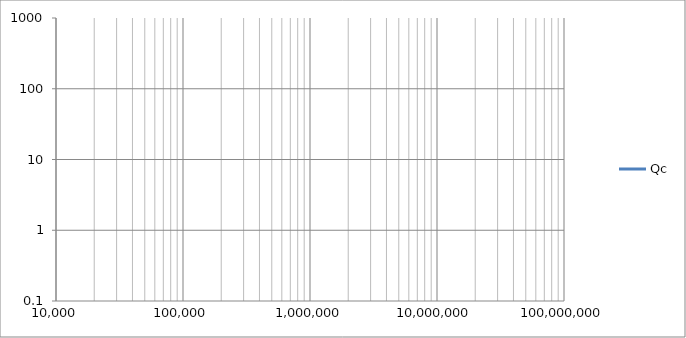
| Category | Qc |
|---|---|
| 300.0 | 13.985 |
| 308.982 | 12.086 |
| 318.234 | 12.381 |
| 327.762 | 12.87 |
| 337.575 | 13.091 |
| 347.683 | 13.652 |
| 358.093 | 13.87 |
| 368.814 | 14.169 |
| 379.857 | 14.576 |
| 391.23 | 15.074 |
| 402.944 | 15.55 |
| 415.009 | 16.359 |
| 427.434 | 16.381 |
| 440.232 | 17.245 |
| 453.413 | 17.623 |
| 466.989 | 18.268 |
| 480.971 | 18.899 |
| 495.372 | 19.556 |
| 510.204 | 19.558 |
| 525.48 | 20.106 |
| 541.213 | 20.949 |
| 557.417 | 21.407 |
| 574.107 | 21.695 |
| 591.296 | 22.242 |
| 609.0 | 22.685 |
| 627.234 | 23.336 |
| 646.015 | 24.001 |
| 665.357 | 24.457 |
| 685.278 | 25.302 |
| 705.796 | 25.876 |
| 726.928 | 26.497 |
| 748.693 | 26.907 |
| 771.11 | 27.737 |
| 794.198 | 28.277 |
| 817.977 | 28.243 |
| 842.468 | 29.579 |
| 867.692 | 30.068 |
| 893.672 | 30.589 |
| 920.429 | 30.889 |
| 947.988 | 31.031 |
| 976.372 | 32.179 |
| 1005.605 | 31.878 |
| 1035.714 | 32.568 |
| 1066.724 | 33.331 |
| 1098.663 | 33.691 |
| 1131.558 | 34.01 |
| 1165.438 | 34.395 |
| 1200.332 | 34.87 |
| 1236.272 | 35.597 |
| 1273.287 | 35.981 |
| 1311.41 | 36.493 |
| 1350.675 | 37.357 |
| 1391.116 | 37.522 |
| 1432.767 | 37.865 |
| 1475.666 | 38.747 |
| 1519.849 | 38.834 |
| 1565.354 | 39.549 |
| 1612.223 | 39.963 |
| 1660.494 | 40.322 |
| 1710.211 | 40.608 |
| 1761.417 | 40.702 |
| 1814.155 | 41.461 |
| 1868.473 | 41.749 |
| 1924.417 | 42.306 |
| 1982.036 | 42.968 |
| 2041.38 | 43.081 |
| 2102.501 | 43.45 |
| 2165.452 | 44.043 |
| 2230.287 | 44.468 |
| 2297.064 | 44.902 |
| 2365.841 | 45.117 |
| 2436.677 | 45.531 |
| 2509.633 | 45.663 |
| 2584.774 | 45.881 |
| 2662.165 | 46.528 |
| 2741.873 | 46.792 |
| 2823.967 | 47.087 |
| 2908.519 | 47.454 |
| 2995.603 | 48.038 |
| 3085.295 | 49.242 |
| 3177.672 | 49.362 |
| 3272.814 | 49.699 |
| 3370.806 | 50.016 |
| 3471.731 | 50.105 |
| 3575.678 | 50.604 |
| 3682.737 | 51.077 |
| 3793.002 | 51.571 |
| 3906.568 | 51.311 |
| 4023.535 | 51.797 |
| 4144.004 | 52.259 |
| 4268.079 | 52.175 |
| 4395.87 | 52.592 |
| 4527.487 | 52.774 |
| 4663.044 | 52.885 |
| 4802.66 | 52.998 |
| 4946.457 | 53.104 |
| 5094.558 | 53.041 |
| 5247.095 | 53.492 |
| 5404.198 | 53.626 |
| 5566.005 | 53.514 |
| 5732.657 | 53.522 |
| 5904.298 | 53.632 |
| 6081.079 | 52.102 |
| 6263.152 | 53.412 |
| 6450.677 | 53.574 |
| 6643.817 | 53.683 |
| 6842.74 | 53.533 |
| 7047.618 | 53.592 |
| 7258.631 | 53.478 |
| 7475.962 | 53.051 |
| 7699.799 | 53.455 |
| 7930.339 | 53.351 |
| 8167.781 | 53.398 |
| 8412.333 | 53.316 |
| 8664.207 | 53.419 |
| 8923.622 | 53.462 |
| 9190.804 | 53.362 |
| 9465.986 | 53.751 |
| 9749.407 | 53.921 |
| 10041.314 | 53.677 |
| 10341.961 | 53.887 |
| 10651.609 | 53.985 |
| 10970.529 | 54.211 |
| 11298.998 | 54.284 |
| 11637.301 | 54.455 |
| 11985.733 | 54.708 |
| 12344.598 | 54.835 |
| 12714.208 | 54.974 |
| 13094.884 | 55.195 |
| 13486.958 | 55.251 |
| 13890.771 | 55.649 |
| 14306.674 | 55.603 |
| 14735.03 | 55.95 |
| 15176.212 | 56.264 |
| 15630.603 | 56.602 |
| 16098.599 | 56.989 |
| 16580.607 | 57.441 |
| 17077.047 | 57.823 |
| 17588.351 | 58.342 |
| 18114.964 | 58.74 |
| 18657.344 | 59.1 |
| 19215.963 | 59.661 |
| 19791.308 | 60.009 |
| 20383.88 | 60.441 |
| 20994.194 | 60.982 |
| 21622.781 | 61.424 |
| 22270.189 | 61.956 |
| 22936.98 | 62.409 |
| 23623.736 | 62.966 |
| 24331.055 | 63.495 |
| 25059.551 | 63.873 |
| 25809.859 | 64.273 |
| 26582.632 | 64.736 |
| 27378.542 | 64.992 |
| 28198.283 | 65.316 |
| 29042.568 | 65.624 |
| 29912.132 | 65.817 |
| 30807.731 | 64.517 |
| 31730.145 | 64.597 |
| 32680.177 | 64.587 |
| 33658.654 | 64.614 |
| 34666.428 | 64.759 |
| 35704.376 | 65.169 |
| 36773.4 | 65.867 |
| 37874.433 | 66.518 |
| 39008.431 | 67.015 |
| 40176.383 | 67.355 |
| 41379.304 | 67.714 |
| 42618.241 | 67.998 |
| 43894.274 | 68.256 |
| 45208.513 | 68.596 |
| 46562.101 | 68.98 |
| 47956.216 | 69.366 |
| 49392.073 | 69.725 |
| 50870.922 | 67.792 |
| 52394.048 | 68.137 |
| 53962.778 | 68.54 |
| 55578.477 | 71.382 |
| 57242.553 | 71.827 |
| 58956.452 | 72.296 |
| 60721.667 | 70.307 |
| 62539.734 | 70.608 |
| 64412.237 | 71.067 |
| 66340.803 | 74.231 |
| 68327.113 | 74.078 |
| 70372.895 | 74.599 |
| 72479.93 | 75.06 |
| 74650.052 | 75.638 |
| 76885.149 | 76.422 |
| 79187.167 | 77.015 |
| 81558.11 | 77.728 |
| 84000.042 | 78.441 |
| 86515.087 | 78.698 |
| 89105.435 | 79.307 |
| 91773.341 | 80.039 |
| 94521.126 | 80.756 |
| 97351.184 | 81.474 |
| 100265.975 | 82.723 |
| 103268.039 | 83.442 |
| 106359.987 | 84.134 |
| 109544.512 | 84.883 |
| 112824.384 | 85.248 |
| 116202.459 | 85.982 |
| 119681.676 | 86.828 |
| 123265.065 | 87.6 |
| 126955.745 | 88.462 |
| 130756.927 | 89.216 |
| 134671.92 | 89.962 |
| 138704.132 | 90.83 |
| 142857.072 | 91.625 |
| 147134.356 | 92.432 |
| 151539.705 | 93.886 |
| 156076.956 | 94.748 |
| 160750.056 | 95.587 |
| 165563.073 | 95.969 |
| 170520.197 | 96.847 |
| 175625.742 | 97.796 |
| 180884.152 | 98.744 |
| 186300.005 | 99.62 |
| 191878.013 | 100.6 |
| 197623.033 | 101.571 |
| 203540.064 | 103.091 |
| 209634.257 | 104.091 |
| 215910.916 | 105.136 |
| 222375.505 | 105.804 |
| 229033.65 | 106.863 |
| 235891.146 | 107.958 |
| 242953.963 | 109.17 |
| 250228.248 | 110.312 |
| 257720.332 | 111.52 |
| 265436.736 | 112.741 |
| 273384.177 | 113.986 |
| 281569.573 | 115.219 |
| 290000.047 | 116.407 |
| 298682.939 | 118.02 |
| 307625.805 | 119.042 |
| 316836.429 | 119.964 |
| 326322.828 | 120.941 |
| 336093.26 | 121.449 |
| 346156.228 | 122.307 |
| 356520.492 | 123.175 |
| 367195.072 | 123.869 |
| 378189.259 | 124.624 |
| 389512.624 | 125.264 |
| 401175.021 | 125.937 |
| 413186.602 | 126.546 |
| 425557.822 | 127.047 |
| 438299.449 | 127.463 |
| 451422.573 | 128.092 |
| 464938.616 | 128.433 |
| 478859.343 | 128.59 |
| 493196.87 | 128.803 |
| 507963.678 | 129.326 |
| 523172.618 | 129.316 |
| 538836.929 | 129.275 |
| 554970.246 | 129.205 |
| 571586.61 | 128.995 |
| 588700.484 | 128.561 |
| 606326.765 | 127.978 |
| 624480.795 | 127.295 |
| 643178.374 | 126.554 |
| 662435.778 | 126.077 |
| 682269.767 | 124.991 |
| 702697.606 | 123.677 |
| 723737.075 | 122.222 |
| 745406.487 | 120.609 |
| 767724.702 | 118.723 |
| 790711.147 | 116.65 |
| 814385.83 | 114.215 |
| 838769.355 | 111.431 |
| 863882.949 | 108.542 |
| 889748.468 | 105.261 |
| 916388.426 | 101.247 |
| 943826.012 | 97.458 |
| 972085.107 | 93.417 |
| 1001190.307 | 89.664 |
| 1031166.945 | 85.174 |
| 1062041.115 | 80.557 |
| 1093839.687 | 75.9 |
| 1126590.341 | 71.23 |
| 1160321.582 | 66.606 |
| 1195062.771 | 62.113 |
| 1230844.145 | 57.76 |
| 1267696.849 | 53.614 |
| 1305652.96 | 49.726 |
| 1344745.515 | 46.076 |
| 1385008.54 | 42.709 |
| 1426477.081 | 39.626 |
| 1469187.231 | 36.809 |
| 1513176.165 | 34.271 |
| 1558482.173 | 31.987 |
| 1605144.687 | 29.961 |
| 1653204.324 | 28.145 |
| 1702702.914 | 26.532 |
| 1753683.542 | 25.097 |
| 1806190.58 | 23.811 |
| 1860269.732 | 22.648 |
| 1915968.068 | 21.591 |
| 1973334.067 | 20.624 |
| 2032417.662 | 19.734 |
| 2093270.279 | 18.905 |
| 2155944.884 | 18.133 |
| 2220496.029 | 17.406 |
| 2286979.9 | 16.717 |
| 2355454.365 | 16.063 |
| 2425979.024 | 15.441 |
| 2498615.261 | 14.845 |
| 2573426.3 | 14.275 |
| 2650477.256 | 13.728 |
| 2729835.195 | 13.2 |
| 2811569.19 | 12.696 |
| 2895750.383 | 12.211 |
| 2982452.044 | 11.742 |
| 3071749.64 | 11.291 |
| 3163720.896 | 10.856 |
| 3258445.862 | 10.438 |
| 3356006.989 | 10.034 |
| 3456489.194 | 9.645 |
| 3559979.936 | 9.269 |
| 3666569.295 | 8.906 |
| 3776350.045 | 8.557 |
| 3889417.741 | 8.22 |
| 4005870.797 | 7.893 |
| 4125810.574 | 7.578 |
| 4249341.467 | 7.274 |
| 4376570.999 | 6.978 |
| 4507609.91 | 6.694 |
| 4642572.258 | 6.42 |
| 4781575.513 | 6.156 |
| 4924740.664 | 5.9 |
| 5072192.323 | 5.654 |
| 5224058.833 | 5.417 |
| 5380472.377 | 5.188 |
| 5541569.099 | 4.967 |
| 5707489.219 | 4.756 |
| 5878377.152 | 4.552 |
| 6054381.641 | 4.357 |
| 6235655.881 | 4.17 |
| 6422357.652 | 3.991 |
| 6614649.461 | 3.82 |
| 6812698.679 | 3.656 |
| 7016677.689 | 3.5 |
| 7226764.034 | 3.352 |
| 7443140.575 | 3.211 |
| 7665995.645 | 3.077 |
| 7895523.219 | 2.949 |
| 8131923.078 | 2.829 |
| 8375400.985 | 2.714 |
| 8626168.864 | 2.606 |
| 8884444.985 | 2.503 |
| 9150454.15 | 2.406 |
| 9424427.896 | 2.314 |
| 9706604.689 | 2.228 |
| 9997230.138 | 2.146 |
| 10296557.204 | 2.069 |
| 10604846.421 | 1.996 |
| 10922366.125 | 1.927 |
| 11249392.687 | 1.862 |
| 11586210.751 | 1.801 |
| 11933113.485 | 1.743 |
| 12290402.833 | 1.688 |
| 12658389.782 | 1.636 |
| 13037394.628 | 1.586 |
| 13427747.258 | 1.539 |
| 13829787.435 | 1.494 |
| 14243865.098 | 1.452 |
| 14670340.66 | 1.412 |
| 15109585.327 | 1.373 |
| 15561981.418 | 1.337 |
| 16027922.7 | 1.302 |
| 16507814.73 | 1.269 |
| 17002075.208 | 1.237 |
| 17511134.338 | 1.208 |
| 18035435.208 | 1.179 |
| 18575434.169 | 1.152 |
| 19131601.24 | 1.127 |
| 19704420.509 | 1.102 |
| 20294390.559 | 1.08 |
| 20902024.902 | 1.058 |
| 21527852.426 | 1.038 |
| 22172417.85 | 1.019 |
| 22836282.209 | 1.002 |
| 23520023.329 | 0.985 |
| 24224236.343 | 0.97 |
| 24949534.198 | 0.957 |
| 25696548.197 | 0.944 |
| 26465928.541 | 0.932 |
| 27258344.902 | 0.922 |
| 28074487.001 | 0.913 |
| 28915065.21 | 0.905 |
| 29780811.171 | 0.898 |
| 30672478.432 | 0.893 |
| 31590843.103 | 0.889 |
| 32536704.529 | 0.884 |
| 33510885.993 | 0.882 |
| 34514235.423 | 0.88 |
| 35547626.139 | 0.881 |
| 36611957.606 | 0.882 |
| 37708156.221 | 0.885 |
| 38837176.118 | 0.89 |
| 40000000.0 | 0.896 |